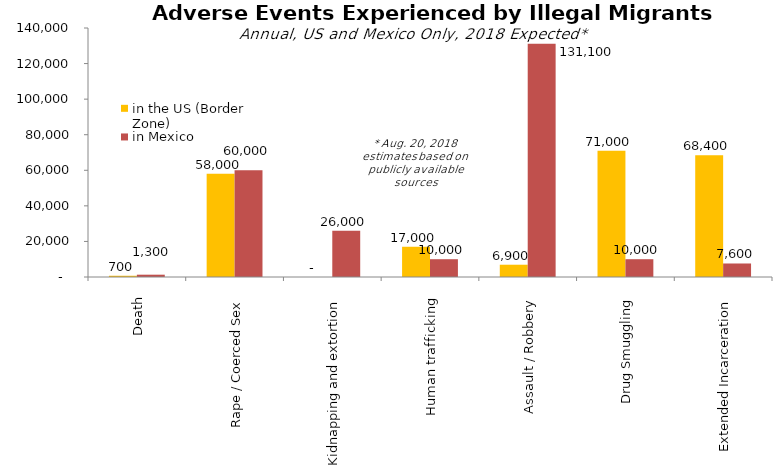
| Category | in the US (Border Zone) | in Mexico |
|---|---|---|
|  Death  | 700 | 1300 |
|  Rape / Coerced Sex  | 58000 | 60000 |
|  Kidnapping and extortion  | 0 | 26000 |
|  Human trafficking  | 17000 | 10000 |
|  Assault / Robbery  | 6900 | 131100 |
|  Drug Smuggling  | 71000 | 10000 |
|  Extended Incarceration  | 68400 | 7600 |